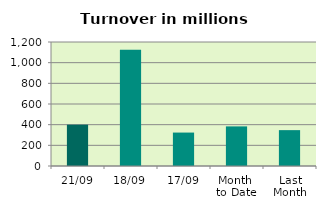
| Category | Series 0 |
|---|---|
| 21/09 | 399.992 |
| 18/09 | 1124.218 |
| 17/09 | 323.53 |
| Month 
to Date | 383.339 |
| Last
Month | 347.074 |